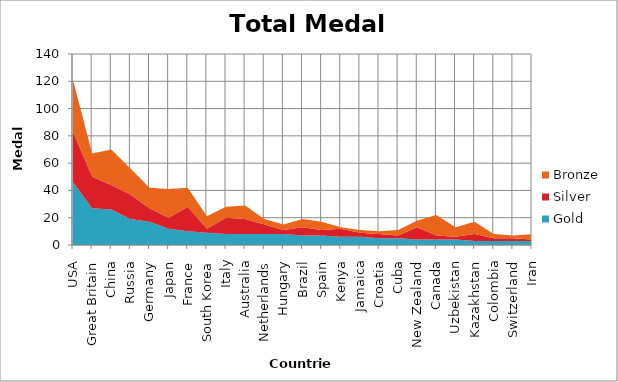
| Category | Gold | Silver | Bronze |
|---|---|---|---|
| USA | 46 | 37 | 38 |
| Great Britain | 27 | 23 | 17 |
| China | 26 | 18 | 26 |
| Russia | 19 | 18 | 19 |
| Germany | 17 | 10 | 15 |
| Japan | 12 | 8 | 21 |
| France | 10 | 18 | 14 |
| South Korea | 9 | 3 | 9 |
| Italy | 8 | 12 | 8 |
| Australia | 8 | 11 | 10 |
| Netherlands | 8 | 7 | 4 |
| Hungary | 8 | 3 | 4 |
| Brazil | 7 | 6 | 6 |
| Spain | 7 | 4 | 6 |
| Kenya | 6 | 6 | 1 |
| Jamaica | 6 | 3 | 2 |
| Croatia | 5 | 3 | 2 |
| Cuba | 5 | 2 | 4 |
| New Zealand | 4 | 9 | 5 |
| Canada | 4 | 3 | 15 |
| Uzbekistan | 4 | 2 | 7 |
| Kazakhstan | 3 | 5 | 9 |
| Colombia | 3 | 2 | 3 |
| Switzerland | 3 | 2 | 2 |
| Iran | 3 | 1 | 4 |